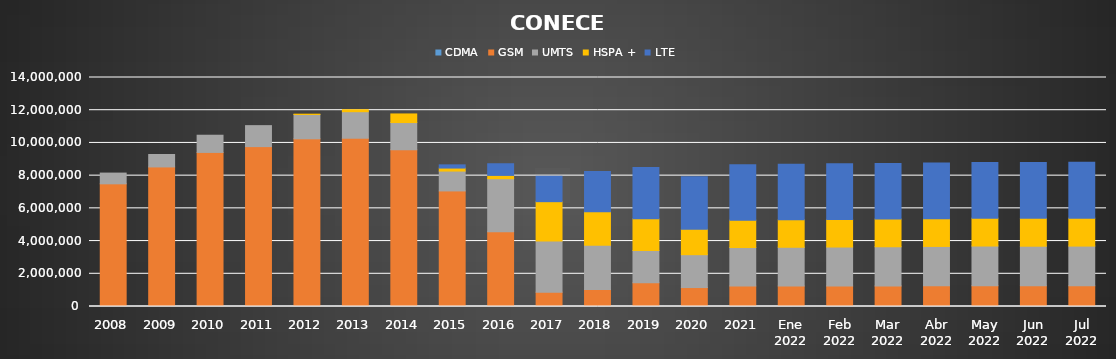
| Category | CDMA | GSM | UMTS | HSPA + | LTE |
|---|---|---|---|---|---|
| 2008 | 0 | 7499370 | 656989 | 0 | 0 |
| 2009 | 0 | 8532691 | 758577 | 0 | 0 |
| 2010 | 0 | 9419193 | 1051309 | 0 | 0 |
| 2011 | 0 | 9774865 | 1282451 | 0 | 0 |
| 2012 | 0 | 10252457 | 1484003 | 21446 | 0 |
| 2013 | 0 | 10287259 | 1622034 | 121593 | 0 |
| 2014 | 0 | 9581956 | 1664758 | 525306 | 0 |
| 2015 | 0 | 7065313 | 1214567 | 183109 | 195630 |
| 2016 | 0 | 4571999 | 3240700 | 201567 | 712557 |
| 2017 | 0 | 873346 | 3135577 | 2399460 | 1551880 |
| 2018 | 0 | 1039373 | 2706058 | 2049418 | 2453201 |
| 2019 | 0 | 1452334 | 1970422 | 1937931 | 3132367 |
| 2020 | 0 | 1158751 | 2009264 | 1548440 | 3212798 |
| 2021 | 0 | 1250925 | 2353798 | 1675346 | 3385646 |
| Ene 2022 | 0 | 1253803 | 2367204 | 1682872 | 3391452 |
| Feb 2022 | 0 | 1256245 | 2379435 | 1688963 | 3397299 |
| Mar 2022 | 0 | 1259631 | 2392596 | 1693034 | 3401696 |
| Abr 2022 | 0 | 1264438 | 2406911 | 1697322 | 3404685 |
| May 2022 | 0 | 1270140 | 2426173 | 1703122 | 3410983 |
| Jun 2022 | 0 | 1262085 | 2423097 | 1704279 | 3412930 |
| Jul 2022 | 0 | 1263792 | 2429301 | 1706746 | 3411593 |